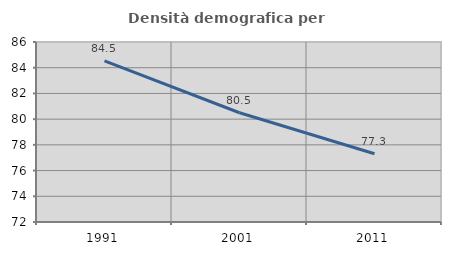
| Category | Densità demografica |
|---|---|
| 1991.0 | 84.533 |
| 2001.0 | 80.498 |
| 2011.0 | 77.306 |